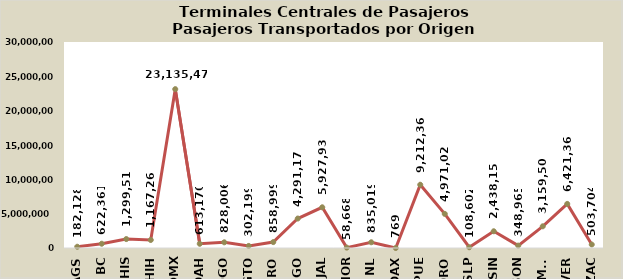
| Category | Total general |
|---|---|
| AGS | 182128 |
| BC | 622361 |
| CHIS | 1299513 |
| CHIH | 1167265 |
| CDMX | 23135473 |
| COAH | 613170 |
| DGO | 828006 |
| GTO | 302199 |
| GRO | 858999 |
| HGO | 4291175 |
| JAL | 5927934 |
| MOR | 58668 |
| NL | 835019 |
| OAX | 769 |
| PUE | 9212365 |
| QRO | 4971020 |
| SLP | 108602 |
| SIN | 2438151 |
| SON | 348965 |
| TAMPS | 3159504 |
| VER | 6421363 |
| ZAC | 503704 |